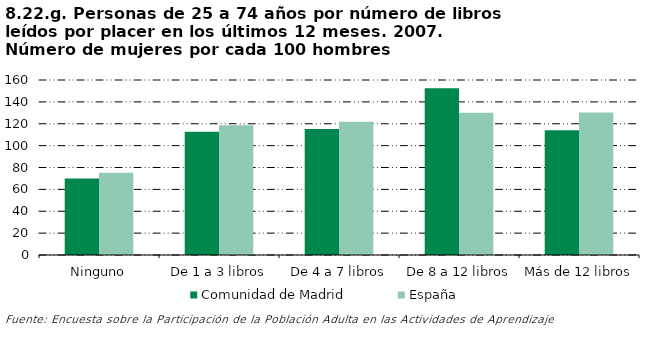
| Category | Comunidad de Madrid | España |
|---|---|---|
| Ninguno | 70.024 | 75.2 |
| De 1 a 3 libros | 112.781 | 118.684 |
| De 4 a 7 libros | 115.238 | 121.911 |
| De 8 a 12 libros | 152.381 | 130 |
| Más de 12 libros | 113.987 | 130.241 |